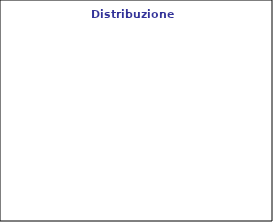
| Category | Series 0 |
|---|---|
| lunedì | 0 |
| martedì | 0 |
| mercoledì | 0 |
| giovedì | 0 |
| venerdì | 0 |
| sabato | 0 |
| domenica | 0 |